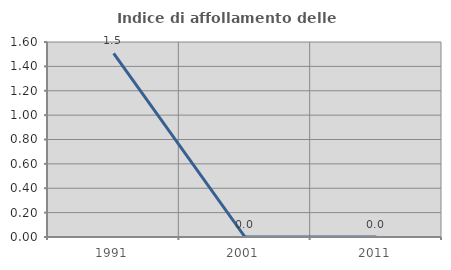
| Category | Indice di affollamento delle abitazioni  |
|---|---|
| 1991.0 | 1.508 |
| 2001.0 | 0 |
| 2011.0 | 0 |